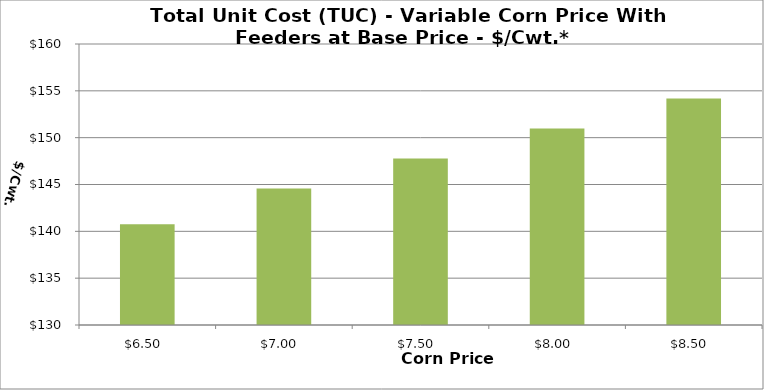
| Category | TUC |
|---|---|
| 6.5 | 140.751 |
| 7.0 | 144.563 |
| 7.5 | 147.769 |
| 8.0 | 150.975 |
| 8.5 | 154.181 |